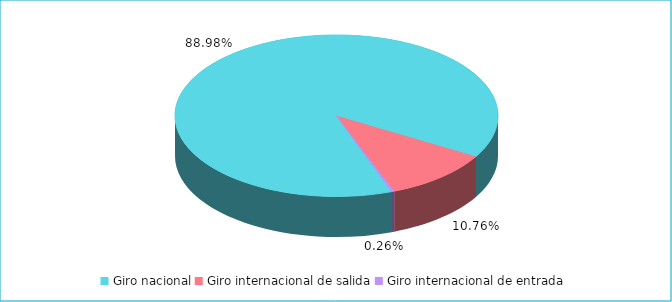
| Category | Series 0 |
|---|---|
| Giro nacional | 0.89 |
| Giro internacional de salida | 0.108 |
| Giro internacional de entrada | 0.003 |